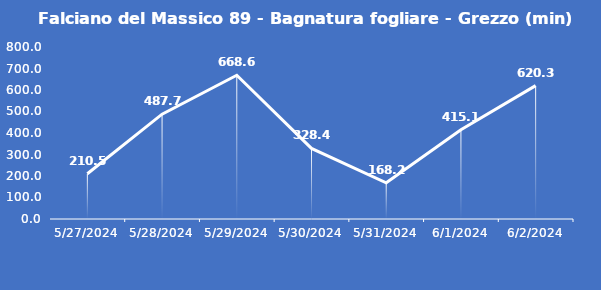
| Category | Falciano del Massico 89 - Bagnatura fogliare - Grezzo (min) |
|---|---|
| 5/27/24 | 210.5 |
| 5/28/24 | 487.7 |
| 5/29/24 | 668.6 |
| 5/30/24 | 328.4 |
| 5/31/24 | 168.2 |
| 6/1/24 | 415.1 |
| 6/2/24 | 620.3 |